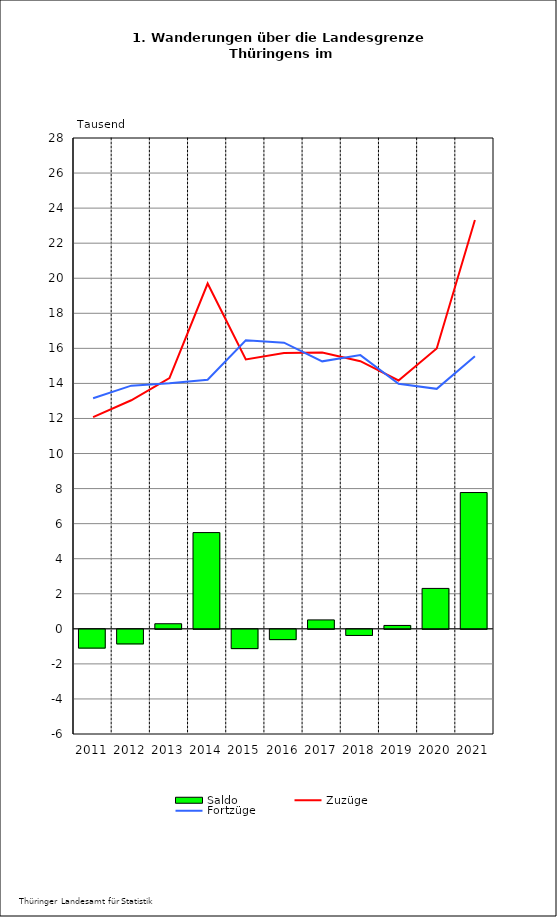
| Category | Saldo |
|---|---|
| 2011.0 | -1.071 |
| 2012.0 | -0.832 |
| 2013.0 | 0.29 |
| 2014.0 | 5.49 |
| 2015.0 | -1.1 |
| 2016.0 | -0.587 |
| 2017.0 | 0.508 |
| 2018.0 | -0.349 |
| 2019.0 | 0.193 |
| 2020.0 | 2.305 |
| 2021.0 | 7.775 |